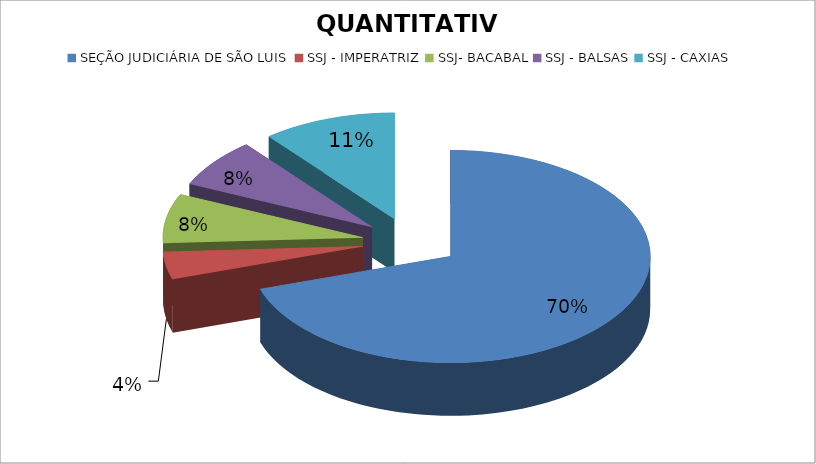
| Category | QUANTITATIVO |
|---|---|
| SEÇÃO JUDICIÁRIA DE SÃO LUIS | 84 |
| SSJ - IMPERATRIZ | 5 |
| SSJ- BACABAL | 9 |
| SSJ - BALSAS | 9 |
| SSJ - CAXIAS | 13 |